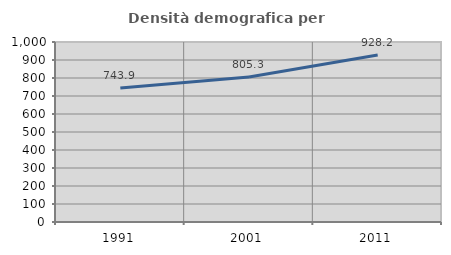
| Category | Densità demografica |
|---|---|
| 1991.0 | 743.855 |
| 2001.0 | 805.29 |
| 2011.0 | 928.159 |